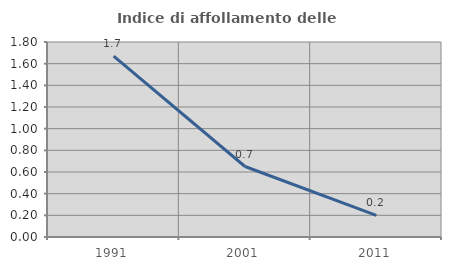
| Category | Indice di affollamento delle abitazioni  |
|---|---|
| 1991.0 | 1.67 |
| 2001.0 | 0.651 |
| 2011.0 | 0.199 |